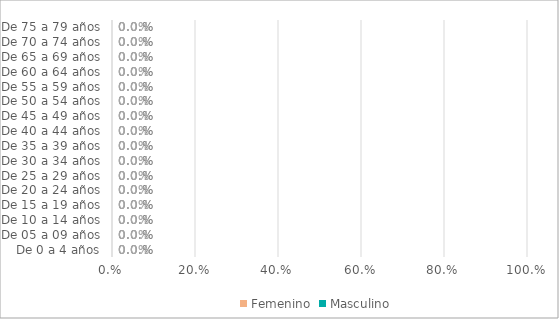
| Category | Femenino | Masculino |
|---|---|---|
| De 0 a 4 años | 0 | 0 |
| De 05 a 09 años | 0 | 0 |
| De 10 a 14 años | 0 | 0 |
| De 15 a 19 años | 0 | 0 |
| De 20 a 24 años | 0 | 0 |
| De 25 a 29 años | 0 | 0 |
| De 30 a 34 años | 0 | 0 |
| De 35 a 39 años | 0 | 0 |
| De 40 a 44 años | 0 | 0 |
| De 45 a 49 años | 0 | 0 |
| De 50 a 54 años | 0 | 0 |
| De 55 a 59 años | 0 | 0 |
| De 60 a 64 años | 0 | 0 |
| De 65 a 69 años | 0 | 0 |
| De 70 a 74 años | 0 | 0 |
| De 75 a 79 años | 0 | 0 |